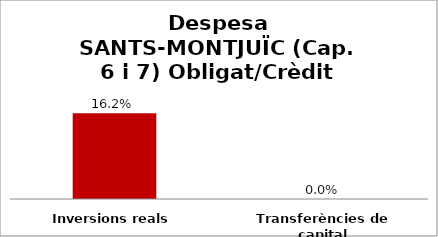
| Category | Series 0 |
|---|---|
| Inversions reals | 0.162 |
| Transferències de capital | 0 |